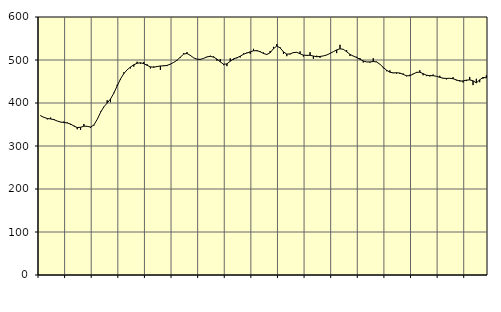
| Category | Piggar | Series 1 |
|---|---|---|
| nan | 371.2 | 370.12 |
| 87.0 | 366.7 | 366.5 |
| 87.0 | 361.9 | 363.95 |
| 87.0 | 366.2 | 362.88 |
| nan | 362.8 | 361.24 |
| 88.0 | 358.2 | 358.05 |
| 88.0 | 355.3 | 355.75 |
| 88.0 | 357 | 354.68 |
| nan | 354.8 | 353.52 |
| 89.0 | 349.2 | 350.98 |
| 89.0 | 347.4 | 346.34 |
| 89.0 | 338.9 | 342.83 |
| nan | 337.6 | 343.46 |
| 90.0 | 351.2 | 346.04 |
| 90.0 | 346.3 | 345.77 |
| 90.0 | 342 | 344.07 |
| nan | 347.7 | 348.83 |
| 91.0 | 362.1 | 361.9 |
| 91.0 | 380 | 378.06 |
| 91.0 | 390.4 | 391.03 |
| nan | 406.4 | 399.75 |
| 92.0 | 401.8 | 409.29 |
| 92.0 | 423.9 | 422.83 |
| 92.0 | 442.3 | 439.75 |
| nan | 454.7 | 455.88 |
| 93.0 | 471.4 | 468.32 |
| 93.0 | 477.1 | 477.14 |
| 93.0 | 480.5 | 483.62 |
| nan | 484.7 | 488.86 |
| 94.0 | 495.9 | 492.41 |
| 94.0 | 491.4 | 493.54 |
| 94.0 | 495.4 | 491.53 |
| nan | 490.1 | 487.62 |
| 95.0 | 480.3 | 484.05 |
| 95.0 | 485 | 483.17 |
| 95.0 | 484.4 | 484.81 |
| nan | 476.8 | 486.15 |
| 96.0 | 487.5 | 486.38 |
| 96.0 | 485.9 | 487.44 |
| 96.0 | 490 | 490.4 |
| nan | 493.9 | 494.35 |
| 97.0 | 498.6 | 499.47 |
| 97.0 | 505.2 | 506.67 |
| 97.0 | 515.9 | 513.71 |
| nan | 518.4 | 515.19 |
| 98.0 | 511.7 | 510.69 |
| 98.0 | 505.2 | 504.97 |
| 98.0 | 502.2 | 501.86 |
| nan | 500.5 | 501.54 |
| 99.0 | 503.6 | 503.77 |
| 99.0 | 507.6 | 507.08 |
| 99.0 | 509.9 | 508.47 |
| nan | 508.4 | 506.64 |
| 0.0 | 498.3 | 502.28 |
| 0.0 | 502.3 | 495.69 |
| 0.0 | 488.1 | 490.14 |
| nan | 485.7 | 491 |
| 1.0 | 503.8 | 497.09 |
| 1.0 | 500.6 | 502.7 |
| 1.0 | 504.1 | 505.24 |
| nan | 505.9 | 508.81 |
| 2.0 | 515.5 | 513.4 |
| 2.0 | 517.3 | 516.24 |
| 2.0 | 514.4 | 518.96 |
| nan | 525.9 | 521.43 |
| 3.0 | 520.5 | 521.84 |
| 3.0 | 518.3 | 519.44 |
| 3.0 | 517.5 | 515.14 |
| nan | 513.8 | 512.81 |
| 4.0 | 521 | 516.95 |
| 4.0 | 530.5 | 526.44 |
| 4.0 | 537 | 532.45 |
| nan | 529.7 | 528.13 |
| 5.0 | 514 | 518.87 |
| 5.0 | 508.9 | 513.72 |
| 5.0 | 513.1 | 514.11 |
| nan | 516.3 | 517.18 |
| 6.0 | 517.7 | 517.93 |
| 6.0 | 520 | 514.42 |
| 6.0 | 508.1 | 511.24 |
| nan | 509.4 | 510.84 |
| 7.0 | 518.2 | 510.91 |
| 7.0 | 502.9 | 509.26 |
| 7.0 | 510 | 507.58 |
| nan | 505.2 | 508.18 |
| 8.0 | 509.6 | 509.55 |
| 8.0 | 511.9 | 511.53 |
| 8.0 | 515.6 | 515.3 |
| nan | 519.3 | 519.27 |
| 9.0 | 516 | 523.38 |
| 9.0 | 535.3 | 526.19 |
| 9.0 | 525.4 | 524.84 |
| nan | 523 | 519.22 |
| 10.0 | 509.2 | 513.11 |
| 10.0 | 509.5 | 509.12 |
| 10.0 | 507.5 | 505.81 |
| nan | 504.6 | 501.72 |
| 11.0 | 494.2 | 497.81 |
| 11.0 | 495.3 | 495.49 |
| 11.0 | 493.9 | 495.51 |
| nan | 504.1 | 496.54 |
| 12.0 | 496.1 | 495.35 |
| 12.0 | 490.5 | 490.19 |
| 12.0 | 481 | 482.8 |
| nan | 473.9 | 476.23 |
| 13.0 | 475.8 | 471.67 |
| 13.0 | 469.4 | 470.04 |
| 13.0 | 468.4 | 470.37 |
| nan | 467.9 | 469.7 |
| 14.0 | 468.6 | 466.53 |
| 14.0 | 462 | 463.32 |
| 14.0 | 465.8 | 463.43 |
| nan | 468.1 | 467.24 |
| 15.0 | 470 | 471.26 |
| 15.0 | 476.1 | 471.64 |
| 15.0 | 464.5 | 468.24 |
| nan | 462.5 | 464.59 |
| 16.0 | 461.7 | 463.7 |
| 16.0 | 466.2 | 463.51 |
| 16.0 | 462.4 | 462.14 |
| nan | 463.2 | 459.79 |
| 17.0 | 456.9 | 457.68 |
| 17.0 | 454.9 | 457.15 |
| 17.0 | 457.2 | 457.45 |
| nan | 460.1 | 456.44 |
| 18.0 | 452.4 | 453.68 |
| 18.0 | 453.4 | 450.96 |
| 18.0 | 447.8 | 451.28 |
| nan | 451 | 453.19 |
| 19.0 | 460.6 | 453.74 |
| 19.0 | 441.6 | 451.67 |
| 19.0 | 456.3 | 446.76 |
| nan | 448.3 | 453.79 |
| 20.0 | 456.4 | 459.43 |
| 20.0 | 464.2 | 458.5 |